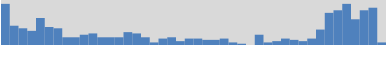
| Category | 32 |
|---|---|
| 40559.798055555555 | 32 |
| 40559.82030819337 | 15 |
| 40559.84256083118 | 13 |
| 40559.864813468994 | 11 |
| 40559.88706610681 | 21 |
| 40559.90931874462 | 14 |
| 40559.93157138243 | 13 |
| 40559.953824020246 | 6 |
| 40559.97607665806 | 6 |
| 40559.99832929587 | 8 |
| 40560.020581933684 | 9 |
| 40560.0428345715 | 6 |
| 40560.06508720931 | 6 |
| 40560.08733984712 | 6 |
| 40560.109592484936 | 10 |
| 40560.13184512275 | 9 |
| 40560.15409776056 | 6 |
| 40560.176350398375 | 2 |
| 40560.19860303619 | 5 |
| 40560.220855674 | 6 |
| 40560.24310831181 | 3 |
| 40560.26536094963 | 5 |
| 40560.28761358744 | 5 |
| 40560.30986622525 | 4 |
| 40560.332118863065 | 4 |
| 40560.35437150088 | 5 |
| 40560.37662413869 | 2 |
| 40560.398876776504 | 1 |
| 40560.42112941432 | 0 |
| 40560.44338205213 | 8 |
| 40560.46563468994 | 2 |
| 40560.487887327756 | 3 |
| 40560.51013996557 | 5 |
| 40560.53239260338 | 4 |
| 40560.554645241195 | 3 |
| 40560.57689787901 | 5 |
| 40560.59915051682 | 12 |
| 40560.62140315463 | 25 |
| 40560.643655792446 | 27 |
| 40560.66590843026 | 32 |
| 40560.68816106807 | 20 |
| 40560.710413705885 | 27 |
| 40560.7326663437 | 29 |
| 40560.75491898148 | 2 |